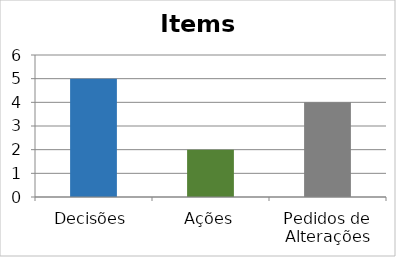
| Category | Series 0 |
|---|---|
| Decisões | 5 |
| Ações | 2 |
| Pedidos de Alterações | 4 |